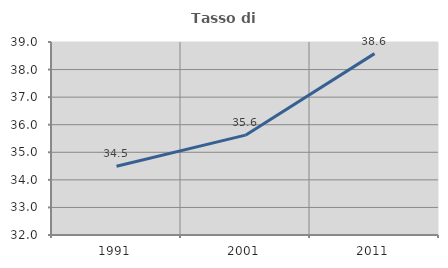
| Category | Tasso di occupazione   |
|---|---|
| 1991.0 | 34.491 |
| 2001.0 | 35.621 |
| 2011.0 | 38.578 |